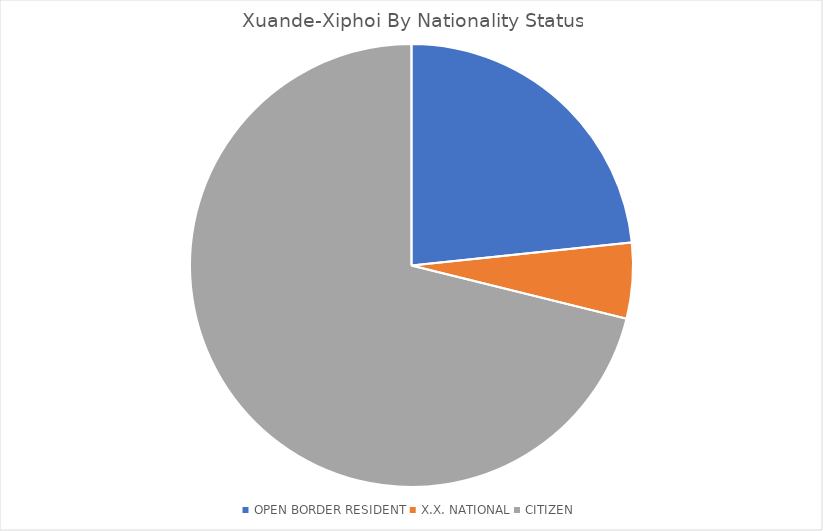
| Category | Series 0 |
|---|---|
| OPEN BORDER RESIDENT | 4086641001.236 |
| X.X. NATIONAL | 966696929.981 |
| CITIZEN | 12457974851.783 |